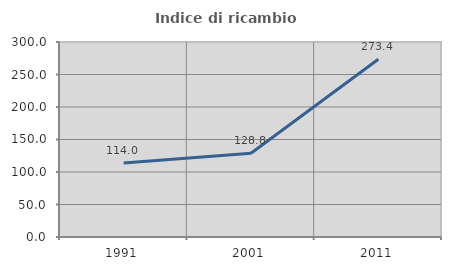
| Category | Indice di ricambio occupazionale  |
|---|---|
| 1991.0 | 113.953 |
| 2001.0 | 128.777 |
| 2011.0 | 273.404 |